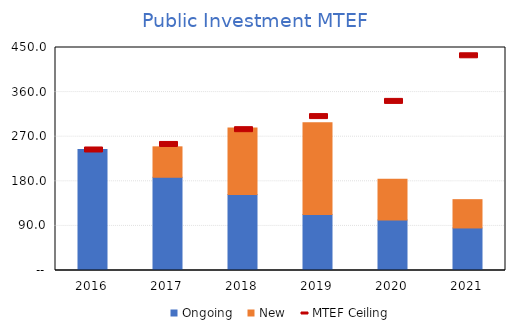
| Category | Ongoing | New |
|---|---|---|
| 2016.0 | 244.2 | 0 |
| 2017.0 | 188.15 | 61.4 |
| 2018.0 | 153.14 | 134.45 |
| 2019.0 | 112.76 | 185.57 |
| 2020.0 | 101.74 | 82.64 |
| 2021.0 | 85.85 | 57.1 |